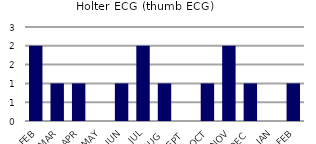
| Category | Holter ECG (thumb ECG) |
|---|---|
| FEB | 2 |
| MAR | 1 |
| APR | 1 |
| MAY | 0 |
| JUN | 1 |
| JUL | 2 |
| AUG | 1 |
| SEPT | 0 |
| OCT | 1 |
| NOV | 2 |
| DEC | 1 |
| JAN | 0 |
| FEB | 1 |